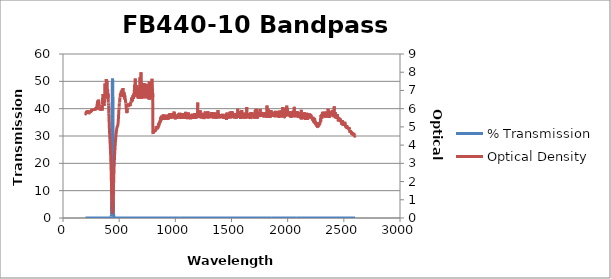
| Category | % Transmission |
|---|---|
| 2600.0 | 0.003 |
| 2599.0 | 0.003 |
| 2598.0 | 0.003 |
| 2597.0 | 0.003 |
| 2596.0 | 0.003 |
| 2595.0 | 0.003 |
| 2594.0 | 0.003 |
| 2593.0 | 0.003 |
| 2592.0 | 0.003 |
| 2591.0 | 0.003 |
| 2590.0 | 0.003 |
| 2589.0 | 0.003 |
| 2588.0 | 0.002 |
| 2587.0 | 0.003 |
| 2586.0 | 0.003 |
| 2585.0 | 0.003 |
| 2584.0 | 0.003 |
| 2583.0 | 0.002 |
| 2582.0 | 0.003 |
| 2581.0 | 0.003 |
| 2580.0 | 0.002 |
| 2579.0 | 0.002 |
| 2578.0 | 0.003 |
| 2577.0 | 0.003 |
| 2576.0 | 0.002 |
| 2575.0 | 0.002 |
| 2574.0 | 0.002 |
| 2573.0 | 0.002 |
| 2572.0 | 0.003 |
| 2571.0 | 0.002 |
| 2570.0 | 0.002 |
| 2569.0 | 0.002 |
| 2568.0 | 0.002 |
| 2567.0 | 0.002 |
| 2566.0 | 0.002 |
| 2565.0 | 0.002 |
| 2564.0 | 0.002 |
| 2563.0 | 0.002 |
| 2562.0 | 0.002 |
| 2561.0 | 0.002 |
| 2560.0 | 0.002 |
| 2559.0 | 0.002 |
| 2558.0 | 0.002 |
| 2557.0 | 0.002 |
| 2556.0 | 0.002 |
| 2555.0 | 0.002 |
| 2554.0 | 0.002 |
| 2553.0 | 0.001 |
| 2552.0 | 0.001 |
| 2551.0 | 0.001 |
| 2550.0 | 0.001 |
| 2549.0 | 0.001 |
| 2548.0 | 0.001 |
| 2547.0 | 0.001 |
| 2546.0 | 0.001 |
| 2545.0 | 0.001 |
| 2544.0 | 0.001 |
| 2543.0 | 0.001 |
| 2542.0 | 0.001 |
| 2541.0 | 0.001 |
| 2540.0 | 0.001 |
| 2539.0 | 0.001 |
| 2538.0 | 0.001 |
| 2537.0 | 0.001 |
| 2536.0 | 0.001 |
| 2535.0 | 0.001 |
| 2534.0 | 0.001 |
| 2533.0 | 0.001 |
| 2532.0 | 0.001 |
| 2531.0 | 0.001 |
| 2530.0 | 0.001 |
| 2529.0 | 0.001 |
| 2528.0 | 0.001 |
| 2527.0 | 0.001 |
| 2526.0 | 0.001 |
| 2525.0 | 0.001 |
| 2524.0 | 0.001 |
| 2523.0 | 0.001 |
| 2522.0 | 0.001 |
| 2521.0 | 0.001 |
| 2520.0 | 0.001 |
| 2519.0 | 0.001 |
| 2518.0 | 0.001 |
| 2517.0 | 0.001 |
| 2516.0 | 0.001 |
| 2515.0 | 0.001 |
| 2514.0 | 0.001 |
| 2513.0 | 0.001 |
| 2512.0 | 0.001 |
| 2511.0 | 0.001 |
| 2510.0 | 0.001 |
| 2509.0 | 0.001 |
| 2508.0 | 0.001 |
| 2507.0 | 0.001 |
| 2506.0 | 0.001 |
| 2505.0 | 0.001 |
| 2504.0 | 0.001 |
| 2503.0 | 0.001 |
| 2502.0 | 0.001 |
| 2501.0 | 0.001 |
| 2500.0 | 0.001 |
| 2499.0 | 0.001 |
| 2498.0 | 0.001 |
| 2497.0 | 0.001 |
| 2496.0 | 0.001 |
| 2495.0 | 0.001 |
| 2494.0 | 0.001 |
| 2493.0 | 0.001 |
| 2492.0 | 0.001 |
| 2491.0 | 0.001 |
| 2490.0 | 0.001 |
| 2489.0 | 0.001 |
| 2488.0 | 0.001 |
| 2487.0 | 0.001 |
| 2486.0 | 0.001 |
| 2485.0 | 0 |
| 2484.0 | 0.001 |
| 2483.0 | 0 |
| 2482.0 | 0.001 |
| 2481.0 | 0.001 |
| 2480.0 | 0.001 |
| 2479.0 | 0.001 |
| 2478.0 | 0 |
| 2477.0 | 0 |
| 2476.0 | 0 |
| 2475.0 | 0.001 |
| 2474.0 | 0 |
| 2473.0 | 0.001 |
| 2472.0 | 0 |
| 2471.0 | 0 |
| 2470.0 | 0 |
| 2469.0 | 0 |
| 2468.0 | 0 |
| 2467.0 | 0 |
| 2466.0 | 0 |
| 2465.0 | 0 |
| 2464.0 | 0 |
| 2463.0 | 0 |
| 2462.0 | 0 |
| 2461.0 | 0 |
| 2460.0 | 0 |
| 2459.0 | 0 |
| 2458.0 | 0 |
| 2457.0 | 0 |
| 2456.0 | 0 |
| 2455.0 | 0 |
| 2454.0 | 0 |
| 2453.0 | 0 |
| 2452.0 | 0 |
| 2451.0 | 0.001 |
| 2450.0 | 0 |
| 2449.0 | 0 |
| 2448.0 | 0 |
| 2447.0 | 0 |
| 2446.0 | 0 |
| 2445.0 | 0 |
| 2444.0 | 0 |
| 2443.0 | 0 |
| 2442.0 | 0 |
| 2441.0 | 0 |
| 2440.0 | 0 |
| 2439.0 | 0 |
| 2438.0 | 0 |
| 2437.0 | 0 |
| 2436.0 | 0 |
| 2435.0 | 0 |
| 2434.0 | 0 |
| 2433.0 | 0 |
| 2432.0 | 0 |
| 2431.0 | 0 |
| 2430.0 | 0 |
| 2429.0 | 0 |
| 2428.0 | 0 |
| 2427.0 | 0 |
| 2426.0 | 0 |
| 2425.0 | 0 |
| 2424.0 | 0 |
| 2423.0 | 0 |
| 2422.0 | 0 |
| 2421.0 | 0 |
| 2420.0 | 0 |
| 2419.0 | 0 |
| 2418.0 | 0 |
| 2417.0 | 0 |
| 2416.0 | 0 |
| 2415.0 | 0 |
| 2414.0 | 0 |
| 2413.0 | 0 |
| 2412.0 | 0 |
| 2411.0 | 0 |
| 2410.0 | 0 |
| 2409.0 | 0 |
| 2408.0 | 0 |
| 2407.0 | 0 |
| 2406.0 | 0 |
| 2405.0 | 0 |
| 2404.0 | 0 |
| 2403.0 | 0 |
| 2402.0 | 0 |
| 2401.0 | 0 |
| 2400.0 | 0 |
| 2399.0 | 0 |
| 2398.0 | 0 |
| 2397.0 | 0 |
| 2396.0 | 0 |
| 2395.0 | 0 |
| 2394.0 | 0 |
| 2393.0 | 0 |
| 2392.0 | 0 |
| 2391.0 | 0 |
| 2390.0 | 0 |
| 2389.0 | 0 |
| 2388.0 | 0 |
| 2387.0 | 0 |
| 2386.0 | 0 |
| 2385.0 | 0 |
| 2384.0 | 0 |
| 2383.0 | 0 |
| 2382.0 | 0 |
| 2381.0 | 0 |
| 2380.0 | 0 |
| 2379.0 | 0 |
| 2378.0 | 0 |
| 2377.0 | 0 |
| 2376.0 | 0 |
| 2375.0 | 0 |
| 2374.0 | 0 |
| 2373.0 | 0 |
| 2372.0 | 0 |
| 2371.0 | 0 |
| 2370.0 | 0 |
| 2369.0 | 0 |
| 2368.0 | 0 |
| 2367.0 | 0 |
| 2366.0 | 0 |
| 2365.0 | 0 |
| 2364.0 | 0 |
| 2363.0 | 0 |
| 2362.0 | 0 |
| 2361.0 | 0 |
| 2360.0 | 0 |
| 2359.0 | 0 |
| 2358.0 | 0 |
| 2357.0 | 0 |
| 2356.0 | 0 |
| 2355.0 | 0 |
| 2354.0 | 0 |
| 2353.0 | 0 |
| 2352.0 | 0 |
| 2351.0 | 0 |
| 2350.0 | 0 |
| 2349.0 | 0 |
| 2348.0 | 0 |
| 2347.0 | 0 |
| 2346.0 | 0 |
| 2345.0 | 0 |
| 2344.0 | 0 |
| 2343.0 | 0 |
| 2342.0 | 0 |
| 2341.0 | 0 |
| 2340.0 | 0 |
| 2339.0 | 0 |
| 2338.0 | 0 |
| 2337.0 | 0 |
| 2336.0 | 0 |
| 2335.0 | 0 |
| 2334.0 | 0 |
| 2333.0 | 0 |
| 2332.0 | 0 |
| 2331.0 | 0 |
| 2330.0 | 0 |
| 2329.0 | 0 |
| 2328.0 | 0 |
| 2327.0 | 0 |
| 2326.0 | 0 |
| 2325.0 | 0 |
| 2324.0 | 0 |
| 2323.0 | 0 |
| 2322.0 | 0 |
| 2321.0 | 0 |
| 2320.0 | 0 |
| 2319.0 | 0 |
| 2318.0 | 0 |
| 2317.0 | 0 |
| 2316.0 | 0 |
| 2315.0 | 0 |
| 2314.0 | 0 |
| 2313.0 | 0 |
| 2312.0 | 0 |
| 2311.0 | 0 |
| 2310.0 | 0 |
| 2309.0 | 0 |
| 2308.0 | 0 |
| 2307.0 | 0 |
| 2306.0 | 0 |
| 2305.0 | 0 |
| 2304.0 | 0 |
| 2303.0 | 0 |
| 2302.0 | 0 |
| 2301.0 | 0 |
| 2300.0 | 0 |
| 2299.0 | 0 |
| 2298.0 | 0 |
| 2297.0 | 0 |
| 2296.0 | 0 |
| 2295.0 | 0 |
| 2294.0 | 0.001 |
| 2293.0 | 0 |
| 2292.0 | 0 |
| 2291.0 | 0.001 |
| 2290.0 | 0.001 |
| 2289.0 | 0.001 |
| 2288.0 | 0.001 |
| 2287.0 | 0.001 |
| 2286.0 | 0.001 |
| 2285.0 | 0.001 |
| 2284.0 | 0.001 |
| 2283.0 | 0.001 |
| 2282.0 | 0.001 |
| 2281.0 | 0.001 |
| 2280.0 | 0.001 |
| 2279.0 | 0.001 |
| 2278.0 | 0.001 |
| 2277.0 | 0.001 |
| 2276.0 | 0.001 |
| 2275.0 | 0.001 |
| 2274.0 | 0.001 |
| 2273.0 | 0.001 |
| 2272.0 | 0.001 |
| 2271.0 | 0.001 |
| 2270.0 | 0.001 |
| 2269.0 | 0.001 |
| 2268.0 | 0.001 |
| 2267.0 | 0.001 |
| 2266.0 | 0.001 |
| 2265.0 | 0.001 |
| 2264.0 | 0.001 |
| 2263.0 | 0.001 |
| 2262.0 | 0.001 |
| 2261.0 | 0.001 |
| 2260.0 | 0.001 |
| 2259.0 | 0.001 |
| 2258.0 | 0.001 |
| 2257.0 | 0.001 |
| 2256.0 | 0.001 |
| 2255.0 | 0.001 |
| 2254.0 | 0.001 |
| 2253.0 | 0.001 |
| 2252.0 | 0.001 |
| 2251.0 | 0.001 |
| 2250.0 | 0.001 |
| 2249.0 | 0.001 |
| 2248.0 | 0.001 |
| 2247.0 | 0.001 |
| 2246.0 | 0 |
| 2245.0 | 0 |
| 2244.0 | 0 |
| 2243.0 | 0 |
| 2242.0 | 0.001 |
| 2241.0 | 0.001 |
| 2240.0 | 0 |
| 2239.0 | 0 |
| 2238.0 | 0 |
| 2237.0 | 0 |
| 2236.0 | 0 |
| 2235.0 | 0 |
| 2234.0 | 0 |
| 2233.0 | 0.001 |
| 2232.0 | 0 |
| 2231.0 | 0.001 |
| 2230.0 | 0 |
| 2229.0 | 0 |
| 2228.0 | 0 |
| 2227.0 | 0 |
| 2226.0 | 0 |
| 2225.0 | 0 |
| 2224.0 | 0 |
| 2223.0 | 0 |
| 2222.0 | 0 |
| 2221.0 | 0 |
| 2220.0 | 0 |
| 2219.0 | 0 |
| 2218.0 | 0 |
| 2217.0 | 0 |
| 2216.0 | 0 |
| 2215.0 | 0 |
| 2214.0 | 0 |
| 2213.0 | 0 |
| 2212.0 | 0 |
| 2211.0 | 0 |
| 2210.0 | 0 |
| 2209.0 | 0 |
| 2208.0 | 0 |
| 2207.0 | 0 |
| 2206.0 | 0 |
| 2205.0 | 0 |
| 2204.0 | 0 |
| 2203.0 | 0 |
| 2202.0 | 0 |
| 2201.0 | 0 |
| 2200.0 | 0 |
| 2199.0 | 0 |
| 2198.0 | 0 |
| 2197.0 | 0 |
| 2196.0 | 0 |
| 2195.0 | 0 |
| 2194.0 | 0 |
| 2193.0 | 0 |
| 2192.0 | 0 |
| 2191.0 | 0 |
| 2190.0 | 0 |
| 2189.0 | 0 |
| 2188.0 | 0 |
| 2187.0 | 0 |
| 2186.0 | 0 |
| 2185.0 | 0 |
| 2184.0 | 0 |
| 2183.0 | 0 |
| 2182.0 | 0 |
| 2181.0 | 0 |
| 2180.0 | 0 |
| 2179.0 | 0 |
| 2178.0 | 0 |
| 2177.0 | 0 |
| 2176.0 | 0 |
| 2175.0 | 0 |
| 2174.0 | 0 |
| 2173.0 | 0 |
| 2172.0 | 0 |
| 2171.0 | 0 |
| 2170.0 | 0 |
| 2169.0 | 0 |
| 2168.0 | 0 |
| 2167.0 | 0 |
| 2166.0 | 0 |
| 2165.0 | 0 |
| 2164.0 | 0 |
| 2163.0 | 0 |
| 2162.0 | 0 |
| 2161.0 | 0 |
| 2160.0 | 0 |
| 2159.0 | 0 |
| 2158.0 | 0 |
| 2157.0 | 0 |
| 2156.0 | 0 |
| 2155.0 | 0 |
| 2154.0 | 0 |
| 2153.0 | 0 |
| 2152.0 | 0 |
| 2151.0 | 0 |
| 2150.0 | 0 |
| 2149.0 | 0 |
| 2148.0 | 0 |
| 2147.0 | 0 |
| 2146.0 | 0 |
| 2145.0 | 0 |
| 2144.0 | 0 |
| 2143.0 | 0 |
| 2142.0 | 0 |
| 2141.0 | 0 |
| 2140.0 | 0 |
| 2139.0 | 0 |
| 2138.0 | 0 |
| 2137.0 | 0 |
| 2136.0 | 0 |
| 2135.0 | 0 |
| 2134.0 | 0 |
| 2133.0 | 0 |
| 2132.0 | 0 |
| 2131.0 | 0 |
| 2130.0 | 0 |
| 2129.0 | 0 |
| 2128.0 | 0 |
| 2127.0 | 0 |
| 2126.0 | 0 |
| 2125.0 | 0 |
| 2124.0 | 0 |
| 2123.0 | 0 |
| 2122.0 | 0 |
| 2121.0 | 0 |
| 2120.0 | 0 |
| 2119.0 | 0 |
| 2118.0 | 0 |
| 2117.0 | 0 |
| 2116.0 | 0 |
| 2115.0 | 0 |
| 2114.0 | 0 |
| 2113.0 | 0 |
| 2112.0 | 0 |
| 2111.0 | 0 |
| 2110.0 | 0 |
| 2109.0 | 0 |
| 2108.0 | 0 |
| 2107.0 | 0 |
| 2106.0 | 0 |
| 2105.0 | 0 |
| 2104.0 | 0 |
| 2103.0 | 0 |
| 2102.0 | 0 |
| 2101.0 | 0 |
| 2100.0 | 0 |
| 2099.0 | 0 |
| 2098.0 | 0 |
| 2097.0 | 0 |
| 2096.0 | 0 |
| 2095.0 | 0 |
| 2094.0 | 0 |
| 2093.0 | 0 |
| 2092.0 | 0 |
| 2091.0 | 0 |
| 2090.0 | 0 |
| 2089.0 | 0 |
| 2088.0 | 0 |
| 2087.0 | 0 |
| 2086.0 | 0 |
| 2085.0 | 0 |
| 2084.0 | 0 |
| 2083.0 | 0 |
| 2082.0 | 0 |
| 2081.0 | 0 |
| 2080.0 | 0 |
| 2079.0 | 0 |
| 2078.0 | 0 |
| 2077.0 | 0 |
| 2076.0 | 0 |
| 2075.0 | 0 |
| 2074.0 | 0 |
| 2073.0 | 0 |
| 2072.0 | 0 |
| 2071.0 | 0 |
| 2070.0 | 0 |
| 2069.0 | 0 |
| 2068.0 | 0 |
| 2067.0 | 0 |
| 2066.0 | 0 |
| 2065.0 | 0 |
| 2064.0 | 0 |
| 2063.0 | 0 |
| 2062.0 | 0 |
| 2061.0 | 0 |
| 2060.0 | 0 |
| 2059.0 | 0 |
| 2058.0 | 0 |
| 2057.0 | 0 |
| 2056.0 | 0 |
| 2055.0 | 0 |
| 2054.0 | 0 |
| 2053.0 | 0 |
| 2052.0 | 0 |
| 2051.0 | 0 |
| 2050.0 | 0 |
| 2049.0 | 0 |
| 2048.0 | 0 |
| 2047.0 | 0 |
| 2046.0 | 0 |
| 2045.0 | 0 |
| 2044.0 | 0 |
| 2043.0 | 0 |
| 2042.0 | 0 |
| 2041.0 | 0 |
| 2040.0 | 0 |
| 2039.0 | 0 |
| 2038.0 | 0 |
| 2037.0 | 0 |
| 2036.0 | 0 |
| 2035.0 | 0 |
| 2034.0 | 0 |
| 2033.0 | 0 |
| 2032.0 | 0 |
| 2031.0 | 0 |
| 2030.0 | 0 |
| 2029.0 | 0 |
| 2028.0 | 0 |
| 2027.0 | 0 |
| 2026.0 | 0 |
| 2025.0 | 0 |
| 2024.0 | 0 |
| 2023.0 | 0 |
| 2022.0 | 0 |
| 2021.0 | 0 |
| 2020.0 | 0 |
| 2019.0 | 0 |
| 2018.0 | 0 |
| 2017.0 | 0 |
| 2016.0 | 0 |
| 2015.0 | 0 |
| 2014.0 | 0 |
| 2013.0 | 0 |
| 2012.0 | 0 |
| 2011.0 | 0 |
| 2010.0 | 0 |
| 2009.0 | 0 |
| 2008.0 | 0 |
| 2007.0 | 0 |
| 2006.0 | 0 |
| 2005.0 | 0 |
| 2004.0 | 0 |
| 2003.0 | 0 |
| 2002.0 | 0 |
| 2001.0 | 0 |
| 2000.0 | 0 |
| 1999.0 | 0 |
| 1998.0 | 0 |
| 1997.0 | 0 |
| 1996.0 | 0 |
| 1995.0 | 0 |
| 1994.0 | 0 |
| 1993.0 | 0 |
| 1992.0 | 0 |
| 1991.0 | 0 |
| 1990.0 | 0 |
| 1989.0 | 0 |
| 1988.0 | 0 |
| 1987.0 | 0 |
| 1986.0 | 0 |
| 1985.0 | 0 |
| 1984.0 | 0 |
| 1983.0 | 0 |
| 1982.0 | 0 |
| 1981.0 | 0 |
| 1980.0 | 0 |
| 1979.0 | 0 |
| 1978.0 | 0 |
| 1977.0 | 0 |
| 1976.0 | 0 |
| 1975.0 | 0 |
| 1974.0 | 0 |
| 1973.0 | 0 |
| 1972.0 | 0 |
| 1971.0 | 0 |
| 1970.0 | 0 |
| 1969.0 | 0 |
| 1968.0 | 0 |
| 1967.0 | 0 |
| 1966.0 | 0 |
| 1965.0 | 0 |
| 1964.0 | 0 |
| 1963.0 | 0 |
| 1962.0 | 0 |
| 1961.0 | 0 |
| 1960.0 | 0 |
| 1959.0 | 0 |
| 1958.0 | 0 |
| 1957.0 | 0 |
| 1956.0 | 0 |
| 1955.0 | 0 |
| 1954.0 | 0 |
| 1953.0 | 0 |
| 1952.0 | 0 |
| 1951.0 | 0 |
| 1950.0 | 0 |
| 1949.0 | 0 |
| 1948.0 | 0 |
| 1947.0 | 0 |
| 1946.0 | 0 |
| 1945.0 | 0 |
| 1944.0 | 0 |
| 1943.0 | 0 |
| 1942.0 | 0 |
| 1941.0 | 0 |
| 1940.0 | 0 |
| 1939.0 | 0 |
| 1938.0 | 0 |
| 1937.0 | 0 |
| 1936.0 | 0 |
| 1935.0 | 0 |
| 1934.0 | 0 |
| 1933.0 | 0 |
| 1932.0 | 0 |
| 1931.0 | 0 |
| 1930.0 | 0 |
| 1929.0 | 0 |
| 1928.0 | 0 |
| 1927.0 | 0 |
| 1926.0 | 0 |
| 1925.0 | 0 |
| 1924.0 | 0 |
| 1923.0 | 0 |
| 1922.0 | 0 |
| 1921.0 | 0 |
| 1920.0 | 0 |
| 1919.0 | 0 |
| 1918.0 | 0 |
| 1917.0 | 0 |
| 1916.0 | 0 |
| 1915.0 | 0 |
| 1914.0 | 0 |
| 1913.0 | 0 |
| 1912.0 | 0 |
| 1911.0 | 0 |
| 1910.0 | 0 |
| 1909.0 | 0 |
| 1908.0 | 0 |
| 1907.0 | 0 |
| 1906.0 | 0 |
| 1905.0 | 0 |
| 1904.0 | 0 |
| 1903.0 | 0 |
| 1902.0 | 0 |
| 1901.0 | 0 |
| 1900.0 | 0 |
| 1899.0 | 0 |
| 1898.0 | 0 |
| 1897.0 | 0 |
| 1896.0 | 0 |
| 1895.0 | 0 |
| 1894.0 | 0 |
| 1893.0 | 0 |
| 1892.0 | 0 |
| 1891.0 | 0 |
| 1890.0 | 0 |
| 1889.0 | 0 |
| 1888.0 | 0 |
| 1887.0 | 0 |
| 1886.0 | 0 |
| 1885.0 | 0 |
| 1884.0 | 0 |
| 1883.0 | 0 |
| 1882.0 | 0 |
| 1881.0 | 0 |
| 1880.0 | 0 |
| 1879.0 | 0 |
| 1878.0 | 0 |
| 1877.0 | 0 |
| 1876.0 | 0 |
| 1875.0 | 0 |
| 1874.0 | 0 |
| 1873.0 | 0 |
| 1872.0 | 0 |
| 1871.0 | 0 |
| 1870.0 | 0 |
| 1869.0 | 0 |
| 1868.0 | 0 |
| 1867.0 | 0 |
| 1866.0 | 0 |
| 1865.0 | 0 |
| 1864.0 | 0 |
| 1863.0 | 0 |
| 1862.0 | 0 |
| 1861.0 | 0 |
| 1860.0 | 0 |
| 1859.0 | 0 |
| 1858.0 | 0 |
| 1857.0 | 0 |
| 1856.0 | 0 |
| 1855.0 | 0 |
| 1854.0 | 0 |
| 1853.0 | 0 |
| 1852.0 | 0 |
| 1851.0 | 0 |
| 1850.0 | 0 |
| 1849.0 | 0 |
| 1848.0 | 0 |
| 1847.0 | 0 |
| 1846.0 | 0 |
| 1845.0 | 0 |
| 1844.0 | 0 |
| 1843.0 | 0 |
| 1842.0 | 0 |
| 1841.0 | 0 |
| 1840.0 | 0 |
| 1839.0 | 0 |
| 1838.0 | 0 |
| 1837.0 | 0 |
| 1836.0 | 0 |
| 1835.0 | 0 |
| 1834.0 | 0 |
| 1833.0 | 0 |
| 1832.0 | 0 |
| 1831.0 | 0 |
| 1830.0 | 0 |
| 1829.0 | 0 |
| 1828.0 | 0 |
| 1827.0 | 0 |
| 1826.0 | 0 |
| 1825.0 | 0 |
| 1824.0 | 0 |
| 1823.0 | 0 |
| 1822.0 | 0 |
| 1821.0 | 0 |
| 1820.0 | 0 |
| 1819.0 | 0 |
| 1818.0 | 0 |
| 1817.0 | 0 |
| 1816.0 | 0 |
| 1815.0 | 0 |
| 1814.0 | 0 |
| 1813.0 | 0 |
| 1812.0 | 0 |
| 1811.0 | 0 |
| 1810.0 | 0 |
| 1809.0 | 0 |
| 1808.0 | 0 |
| 1807.0 | 0 |
| 1806.0 | 0 |
| 1805.0 | 0 |
| 1804.0 | 0 |
| 1803.0 | 0 |
| 1802.0 | 0 |
| 1801.0 | 0 |
| 1800.0 | 0 |
| 1799.0 | 0 |
| 1798.0 | 0 |
| 1797.0 | 0 |
| 1796.0 | 0 |
| 1795.0 | 0 |
| 1794.0 | 0 |
| 1793.0 | 0 |
| 1792.0 | 0 |
| 1791.0 | 0 |
| 1790.0 | 0 |
| 1789.0 | 0 |
| 1788.0 | 0 |
| 1787.0 | 0 |
| 1786.0 | 0 |
| 1785.0 | 0 |
| 1784.0 | 0 |
| 1783.0 | 0 |
| 1782.0 | 0 |
| 1781.0 | 0 |
| 1780.0 | 0 |
| 1779.0 | 0 |
| 1778.0 | 0 |
| 1777.0 | 0 |
| 1776.0 | 0 |
| 1775.0 | 0 |
| 1774.0 | 0 |
| 1773.0 | 0 |
| 1772.0 | 0 |
| 1771.0 | 0 |
| 1770.0 | 0 |
| 1769.0 | 0 |
| 1768.0 | 0 |
| 1767.0 | 0 |
| 1766.0 | 0 |
| 1765.0 | 0 |
| 1764.0 | 0 |
| 1763.0 | 0 |
| 1762.0 | 0 |
| 1761.0 | 0 |
| 1760.0 | 0 |
| 1759.0 | 0 |
| 1758.0 | 0 |
| 1757.0 | 0 |
| 1756.0 | 0 |
| 1755.0 | 0 |
| 1754.0 | 0 |
| 1753.0 | 0 |
| 1752.0 | 0 |
| 1751.0 | 0 |
| 1750.0 | 0 |
| 1749.0 | 0 |
| 1748.0 | 0 |
| 1747.0 | 0 |
| 1746.0 | 0 |
| 1745.0 | 0 |
| 1744.0 | 0 |
| 1743.0 | 0 |
| 1742.0 | 0 |
| 1741.0 | 0 |
| 1740.0 | 0 |
| 1739.0 | 0 |
| 1738.0 | 0 |
| 1737.0 | 0 |
| 1736.0 | 0 |
| 1735.0 | 0 |
| 1734.0 | 0 |
| 1733.0 | 0 |
| 1732.0 | 0 |
| 1731.0 | 0 |
| 1730.0 | 0 |
| 1729.0 | 0 |
| 1728.0 | 0 |
| 1727.0 | 0 |
| 1726.0 | 0 |
| 1725.0 | 0 |
| 1724.0 | 0 |
| 1723.0 | 0 |
| 1722.0 | 0 |
| 1721.0 | 0 |
| 1720.0 | 0 |
| 1719.0 | 0 |
| 1718.0 | 0 |
| 1717.0 | 0 |
| 1716.0 | 0 |
| 1715.0 | 0 |
| 1714.0 | 0 |
| 1713.0 | 0 |
| 1712.0 | 0 |
| 1711.0 | 0 |
| 1710.0 | 0 |
| 1709.0 | 0 |
| 1708.0 | 0 |
| 1707.0 | 0 |
| 1706.0 | 0 |
| 1705.0 | 0 |
| 1704.0 | 0 |
| 1703.0 | 0 |
| 1702.0 | 0 |
| 1701.0 | 0 |
| 1700.0 | 0 |
| 1699.0 | 0 |
| 1698.0 | 0 |
| 1697.0 | 0 |
| 1696.0 | 0 |
| 1695.0 | 0 |
| 1694.0 | 0 |
| 1693.0 | 0 |
| 1692.0 | 0 |
| 1691.0 | 0 |
| 1690.0 | 0 |
| 1689.0 | 0 |
| 1688.0 | 0 |
| 1687.0 | 0 |
| 1686.0 | 0 |
| 1685.0 | 0 |
| 1684.0 | 0 |
| 1683.0 | 0 |
| 1682.0 | 0 |
| 1681.0 | 0 |
| 1680.0 | 0 |
| 1679.0 | 0 |
| 1678.0 | 0 |
| 1677.0 | 0 |
| 1676.0 | 0 |
| 1675.0 | 0 |
| 1674.0 | 0 |
| 1673.0 | 0 |
| 1672.0 | 0 |
| 1671.0 | 0 |
| 1670.0 | 0 |
| 1669.0 | 0 |
| 1668.0 | 0 |
| 1667.0 | 0 |
| 1666.0 | 0 |
| 1665.0 | 0 |
| 1664.0 | 0 |
| 1663.0 | 0 |
| 1662.0 | 0 |
| 1661.0 | 0 |
| 1660.0 | 0 |
| 1659.0 | 0 |
| 1658.0 | 0 |
| 1657.0 | 0 |
| 1656.0 | 0 |
| 1655.0 | 0 |
| 1654.0 | 0 |
| 1653.0 | 0 |
| 1652.0 | 0 |
| 1651.0 | 0 |
| 1650.0 | 0 |
| 1649.0 | 0 |
| 1648.0 | 0 |
| 1647.0 | 0 |
| 1646.0 | 0 |
| 1645.0 | 0 |
| 1644.0 | 0 |
| 1643.0 | 0 |
| 1642.0 | 0 |
| 1641.0 | 0 |
| 1640.0 | 0 |
| 1639.0 | 0 |
| 1638.0 | 0 |
| 1637.0 | 0 |
| 1636.0 | 0 |
| 1635.0 | 0 |
| 1634.0 | 0 |
| 1633.0 | 0 |
| 1632.0 | 0 |
| 1631.0 | 0 |
| 1630.0 | 0 |
| 1629.0 | 0 |
| 1628.0 | 0 |
| 1627.0 | 0 |
| 1626.0 | 0 |
| 1625.0 | 0 |
| 1624.0 | 0 |
| 1623.0 | 0 |
| 1622.0 | 0 |
| 1621.0 | 0 |
| 1620.0 | 0 |
| 1619.0 | 0 |
| 1618.0 | 0 |
| 1617.0 | 0 |
| 1616.0 | 0 |
| 1615.0 | 0 |
| 1614.0 | 0 |
| 1613.0 | 0 |
| 1612.0 | 0 |
| 1611.0 | 0 |
| 1610.0 | 0 |
| 1609.0 | 0 |
| 1608.0 | 0 |
| 1607.0 | 0 |
| 1606.0 | 0 |
| 1605.0 | 0 |
| 1604.0 | 0 |
| 1603.0 | 0 |
| 1602.0 | 0 |
| 1601.0 | 0 |
| 1600.0 | 0 |
| 1599.0 | 0 |
| 1598.0 | 0 |
| 1597.0 | 0 |
| 1596.0 | 0 |
| 1595.0 | 0 |
| 1594.0 | 0 |
| 1593.0 | 0 |
| 1592.0 | 0 |
| 1591.0 | 0 |
| 1590.0 | 0 |
| 1589.0 | 0 |
| 1588.0 | 0 |
| 1587.0 | 0 |
| 1586.0 | 0 |
| 1585.0 | 0 |
| 1584.0 | 0 |
| 1583.0 | 0 |
| 1582.0 | 0 |
| 1581.0 | 0 |
| 1580.0 | 0 |
| 1579.0 | 0 |
| 1578.0 | 0 |
| 1577.0 | 0 |
| 1576.0 | 0 |
| 1575.0 | 0 |
| 1574.0 | 0 |
| 1573.0 | 0 |
| 1572.0 | 0 |
| 1571.0 | 0 |
| 1570.0 | 0 |
| 1569.0 | 0 |
| 1568.0 | 0 |
| 1567.0 | 0 |
| 1566.0 | 0 |
| 1565.0 | 0 |
| 1564.0 | 0 |
| 1563.0 | 0 |
| 1562.0 | 0 |
| 1561.0 | 0 |
| 1560.0 | 0 |
| 1559.0 | 0 |
| 1558.0 | 0 |
| 1557.0 | 0 |
| 1556.0 | 0 |
| 1555.0 | 0 |
| 1554.0 | 0 |
| 1553.0 | 0 |
| 1552.0 | 0 |
| 1551.0 | 0 |
| 1550.0 | 0 |
| 1549.0 | 0 |
| 1548.0 | 0 |
| 1547.0 | 0 |
| 1546.0 | 0 |
| 1545.0 | 0 |
| 1544.0 | 0 |
| 1543.0 | 0 |
| 1542.0 | 0 |
| 1541.0 | 0 |
| 1540.0 | 0 |
| 1539.0 | 0 |
| 1538.0 | 0 |
| 1537.0 | 0 |
| 1536.0 | 0 |
| 1535.0 | 0 |
| 1534.0 | 0 |
| 1533.0 | 0 |
| 1532.0 | 0 |
| 1531.0 | 0 |
| 1530.0 | 0 |
| 1529.0 | 0 |
| 1528.0 | 0 |
| 1527.0 | 0 |
| 1526.0 | 0 |
| 1525.0 | 0 |
| 1524.0 | 0 |
| 1523.0 | 0 |
| 1522.0 | 0 |
| 1521.0 | 0 |
| 1520.0 | 0 |
| 1519.0 | 0 |
| 1518.0 | 0 |
| 1517.0 | 0 |
| 1516.0 | 0 |
| 1515.0 | 0 |
| 1514.0 | 0 |
| 1513.0 | 0 |
| 1512.0 | 0 |
| 1511.0 | 0 |
| 1510.0 | 0 |
| 1509.0 | 0 |
| 1508.0 | 0 |
| 1507.0 | 0 |
| 1506.0 | 0 |
| 1505.0 | 0 |
| 1504.0 | 0 |
| 1503.0 | 0 |
| 1502.0 | 0 |
| 1501.0 | 0 |
| 1500.0 | 0 |
| 1499.0 | 0 |
| 1498.0 | 0 |
| 1497.0 | 0 |
| 1496.0 | 0 |
| 1495.0 | 0 |
| 1494.0 | 0 |
| 1493.0 | 0 |
| 1492.0 | 0 |
| 1491.0 | 0 |
| 1490.0 | 0 |
| 1489.0 | 0 |
| 1488.0 | 0 |
| 1487.0 | 0 |
| 1486.0 | 0 |
| 1485.0 | 0 |
| 1484.0 | 0 |
| 1483.0 | 0 |
| 1482.0 | 0 |
| 1481.0 | 0 |
| 1480.0 | 0 |
| 1479.0 | 0 |
| 1478.0 | 0 |
| 1477.0 | 0 |
| 1476.0 | 0 |
| 1475.0 | 0 |
| 1474.0 | 0 |
| 1473.0 | 0 |
| 1472.0 | 0 |
| 1471.0 | 0 |
| 1470.0 | 0 |
| 1469.0 | 0 |
| 1468.0 | 0 |
| 1467.0 | 0 |
| 1466.0 | 0 |
| 1465.0 | 0 |
| 1464.0 | 0 |
| 1463.0 | 0 |
| 1462.0 | 0 |
| 1461.0 | 0 |
| 1460.0 | 0 |
| 1459.0 | 0 |
| 1458.0 | 0 |
| 1457.0 | 0 |
| 1456.0 | 0 |
| 1455.0 | 0 |
| 1454.0 | 0 |
| 1453.0 | 0 |
| 1452.0 | 0 |
| 1451.0 | 0 |
| 1450.0 | 0 |
| 1449.0 | 0 |
| 1448.0 | 0 |
| 1447.0 | 0 |
| 1446.0 | 0 |
| 1445.0 | 0 |
| 1444.0 | 0 |
| 1443.0 | 0 |
| 1442.0 | 0 |
| 1441.0 | 0 |
| 1440.0 | 0 |
| 1439.0 | 0 |
| 1438.0 | 0 |
| 1437.0 | 0 |
| 1436.0 | 0 |
| 1435.0 | 0 |
| 1434.0 | 0 |
| 1433.0 | 0 |
| 1432.0 | 0 |
| 1431.0 | 0 |
| 1430.0 | 0 |
| 1429.0 | 0 |
| 1428.0 | 0 |
| 1427.0 | 0 |
| 1426.0 | 0 |
| 1425.0 | 0 |
| 1424.0 | 0 |
| 1423.0 | 0 |
| 1422.0 | 0 |
| 1421.0 | 0 |
| 1420.0 | 0 |
| 1419.0 | 0 |
| 1418.0 | 0 |
| 1417.0 | 0 |
| 1416.0 | 0 |
| 1415.0 | 0 |
| 1414.0 | 0 |
| 1413.0 | 0 |
| 1412.0 | 0 |
| 1411.0 | 0 |
| 1410.0 | 0 |
| 1409.0 | 0 |
| 1408.0 | 0 |
| 1407.0 | 0 |
| 1406.0 | 0 |
| 1405.0 | 0 |
| 1404.0 | 0 |
| 1403.0 | 0 |
| 1402.0 | 0 |
| 1401.0 | 0 |
| 1400.0 | 0 |
| 1399.0 | 0 |
| 1398.0 | 0 |
| 1397.0 | 0 |
| 1396.0 | 0 |
| 1395.0 | 0 |
| 1394.0 | 0 |
| 1393.0 | 0 |
| 1392.0 | 0 |
| 1391.0 | 0 |
| 1390.0 | 0 |
| 1389.0 | 0 |
| 1388.0 | 0 |
| 1387.0 | 0 |
| 1386.0 | 0 |
| 1385.0 | 0 |
| 1384.0 | 0 |
| 1383.0 | 0 |
| 1382.0 | 0 |
| 1381.0 | 0 |
| 1380.0 | 0 |
| 1379.0 | 0 |
| 1378.0 | 0 |
| 1377.0 | 0 |
| 1376.0 | 0 |
| 1375.0 | 0 |
| 1374.0 | 0 |
| 1373.0 | 0 |
| 1372.0 | 0 |
| 1371.0 | 0 |
| 1370.0 | 0 |
| 1369.0 | 0 |
| 1368.0 | 0 |
| 1367.0 | 0 |
| 1366.0 | 0 |
| 1365.0 | 0 |
| 1364.0 | 0 |
| 1363.0 | 0 |
| 1362.0 | 0 |
| 1361.0 | 0 |
| 1360.0 | 0 |
| 1359.0 | 0 |
| 1358.0 | 0 |
| 1357.0 | 0 |
| 1356.0 | 0 |
| 1355.0 | 0 |
| 1354.0 | 0 |
| 1353.0 | 0 |
| 1352.0 | 0 |
| 1351.0 | 0 |
| 1350.0 | 0 |
| 1349.0 | 0 |
| 1348.0 | 0 |
| 1347.0 | 0 |
| 1346.0 | 0 |
| 1345.0 | 0 |
| 1344.0 | 0 |
| 1343.0 | 0 |
| 1342.0 | 0 |
| 1341.0 | 0 |
| 1340.0 | 0 |
| 1339.0 | 0 |
| 1338.0 | 0 |
| 1337.0 | 0 |
| 1336.0 | 0 |
| 1335.0 | 0 |
| 1334.0 | 0 |
| 1333.0 | 0 |
| 1332.0 | 0 |
| 1331.0 | 0 |
| 1330.0 | 0 |
| 1329.0 | 0 |
| 1328.0 | 0 |
| 1327.0 | 0 |
| 1326.0 | 0 |
| 1325.0 | 0 |
| 1324.0 | 0 |
| 1323.0 | 0 |
| 1322.0 | 0 |
| 1321.0 | 0 |
| 1320.0 | 0 |
| 1319.0 | 0 |
| 1318.0 | 0 |
| 1317.0 | 0 |
| 1316.0 | 0 |
| 1315.0 | 0 |
| 1314.0 | 0 |
| 1313.0 | 0 |
| 1312.0 | 0 |
| 1311.0 | 0 |
| 1310.0 | 0 |
| 1309.0 | 0 |
| 1308.0 | 0 |
| 1307.0 | 0 |
| 1306.0 | 0 |
| 1305.0 | 0 |
| 1304.0 | 0 |
| 1303.0 | 0 |
| 1302.0 | 0 |
| 1301.0 | 0 |
| 1300.0 | 0 |
| 1299.0 | 0 |
| 1298.0 | 0 |
| 1297.0 | 0 |
| 1296.0 | 0 |
| 1295.0 | 0 |
| 1294.0 | 0 |
| 1293.0 | 0 |
| 1292.0 | 0 |
| 1291.0 | 0 |
| 1290.0 | 0 |
| 1289.0 | 0 |
| 1288.0 | 0 |
| 1287.0 | 0 |
| 1286.0 | 0 |
| 1285.0 | 0 |
| 1284.0 | 0 |
| 1283.0 | 0 |
| 1282.0 | 0 |
| 1281.0 | 0 |
| 1280.0 | 0 |
| 1279.0 | 0 |
| 1278.0 | 0 |
| 1277.0 | 0 |
| 1276.0 | 0 |
| 1275.0 | 0 |
| 1274.0 | 0 |
| 1273.0 | 0 |
| 1272.0 | 0 |
| 1271.0 | 0 |
| 1270.0 | 0 |
| 1269.0 | 0 |
| 1268.0 | 0 |
| 1267.0 | 0 |
| 1266.0 | 0 |
| 1265.0 | 0 |
| 1264.0 | 0 |
| 1263.0 | 0 |
| 1262.0 | 0 |
| 1261.0 | 0 |
| 1260.0 | 0 |
| 1259.0 | 0 |
| 1258.0 | 0 |
| 1257.0 | 0 |
| 1256.0 | 0 |
| 1255.0 | 0 |
| 1254.0 | 0 |
| 1253.0 | 0 |
| 1252.0 | 0 |
| 1251.0 | 0 |
| 1250.0 | 0 |
| 1249.0 | 0 |
| 1248.0 | 0 |
| 1247.0 | 0 |
| 1246.0 | 0 |
| 1245.0 | 0 |
| 1244.0 | 0 |
| 1243.0 | 0 |
| 1242.0 | 0 |
| 1241.0 | 0 |
| 1240.0 | 0 |
| 1239.0 | 0 |
| 1238.0 | 0 |
| 1237.0 | 0 |
| 1236.0 | 0 |
| 1235.0 | 0 |
| 1234.0 | 0 |
| 1233.0 | 0 |
| 1232.0 | 0 |
| 1231.0 | 0 |
| 1230.0 | 0 |
| 1229.0 | 0 |
| 1228.0 | 0 |
| 1227.0 | 0 |
| 1226.0 | 0 |
| 1225.0 | 0 |
| 1224.0 | 0 |
| 1223.0 | 0 |
| 1222.0 | 0 |
| 1221.0 | 0 |
| 1220.0 | 0 |
| 1219.0 | 0 |
| 1218.0 | 0 |
| 1217.0 | 0 |
| 1216.0 | 0 |
| 1215.0 | 0 |
| 1214.0 | 0 |
| 1213.0 | 0 |
| 1212.0 | 0 |
| 1211.0 | 0 |
| 1210.0 | 0 |
| 1209.0 | 0 |
| 1208.0 | 0 |
| 1207.0 | 0 |
| 1206.0 | 0 |
| 1205.0 | 0 |
| 1204.0 | 0 |
| 1203.0 | 0 |
| 1202.0 | 0 |
| 1201.0 | 0 |
| 1200.0 | 0 |
| 1199.0 | 0 |
| 1198.0 | 0 |
| 1197.0 | 0 |
| 1196.0 | 0 |
| 1195.0 | 0 |
| 1194.0 | 0 |
| 1193.0 | 0 |
| 1192.0 | 0 |
| 1191.0 | 0 |
| 1190.0 | 0 |
| 1189.0 | 0 |
| 1188.0 | 0 |
| 1187.0 | 0 |
| 1186.0 | 0 |
| 1185.0 | 0 |
| 1184.0 | 0 |
| 1183.0 | 0 |
| 1182.0 | 0 |
| 1181.0 | 0 |
| 1180.0 | 0 |
| 1179.0 | 0 |
| 1178.0 | 0 |
| 1177.0 | 0 |
| 1176.0 | 0 |
| 1175.0 | 0 |
| 1174.0 | 0 |
| 1173.0 | 0 |
| 1172.0 | 0 |
| 1171.0 | 0 |
| 1170.0 | 0 |
| 1169.0 | 0 |
| 1168.0 | 0 |
| 1167.0 | 0 |
| 1166.0 | 0 |
| 1165.0 | 0 |
| 1164.0 | 0 |
| 1163.0 | 0 |
| 1162.0 | 0 |
| 1161.0 | 0 |
| 1160.0 | 0 |
| 1159.0 | 0 |
| 1158.0 | 0 |
| 1157.0 | 0 |
| 1156.0 | 0 |
| 1155.0 | 0 |
| 1154.0 | 0 |
| 1153.0 | 0 |
| 1152.0 | 0 |
| 1151.0 | 0 |
| 1150.0 | 0 |
| 1149.0 | 0 |
| 1148.0 | 0 |
| 1147.0 | 0 |
| 1146.0 | 0 |
| 1145.0 | 0 |
| 1144.0 | 0 |
| 1143.0 | 0 |
| 1142.0 | 0 |
| 1141.0 | 0 |
| 1140.0 | 0 |
| 1139.0 | 0 |
| 1138.0 | 0 |
| 1137.0 | 0 |
| 1136.0 | 0 |
| 1135.0 | 0 |
| 1134.0 | 0 |
| 1133.0 | 0 |
| 1132.0 | 0 |
| 1131.0 | 0 |
| 1130.0 | 0 |
| 1129.0 | 0 |
| 1128.0 | 0 |
| 1127.0 | 0 |
| 1126.0 | 0 |
| 1125.0 | 0 |
| 1124.0 | 0 |
| 1123.0 | 0 |
| 1122.0 | 0 |
| 1121.0 | 0 |
| 1120.0 | 0 |
| 1119.0 | 0 |
| 1118.0 | 0 |
| 1117.0 | 0 |
| 1116.0 | 0 |
| 1115.0 | 0 |
| 1114.0 | 0 |
| 1113.0 | 0 |
| 1112.0 | 0 |
| 1111.0 | 0 |
| 1110.0 | 0 |
| 1109.0 | 0 |
| 1108.0 | 0 |
| 1107.0 | 0 |
| 1106.0 | 0 |
| 1105.0 | 0 |
| 1104.0 | 0 |
| 1103.0 | 0 |
| 1102.0 | 0 |
| 1101.0 | 0 |
| 1100.0 | 0 |
| 1099.0 | 0 |
| 1098.0 | 0 |
| 1097.0 | 0 |
| 1096.0 | 0 |
| 1095.0 | 0 |
| 1094.0 | 0 |
| 1093.0 | 0 |
| 1092.0 | 0 |
| 1091.0 | 0 |
| 1090.0 | 0 |
| 1089.0 | 0 |
| 1088.0 | 0 |
| 1087.0 | 0 |
| 1086.0 | 0 |
| 1085.0 | 0 |
| 1084.0 | 0 |
| 1083.0 | 0 |
| 1082.0 | 0 |
| 1081.0 | 0 |
| 1080.0 | 0 |
| 1079.0 | 0 |
| 1078.0 | 0 |
| 1077.0 | 0 |
| 1076.0 | 0 |
| 1075.0 | 0 |
| 1074.0 | 0 |
| 1073.0 | 0 |
| 1072.0 | 0 |
| 1071.0 | 0 |
| 1070.0 | 0 |
| 1069.0 | 0 |
| 1068.0 | 0 |
| 1067.0 | 0 |
| 1066.0 | 0 |
| 1065.0 | 0 |
| 1064.0 | 0 |
| 1063.0 | 0 |
| 1062.0 | 0 |
| 1061.0 | 0 |
| 1060.0 | 0 |
| 1059.0 | 0 |
| 1058.0 | 0 |
| 1057.0 | 0 |
| 1056.0 | 0 |
| 1055.0 | 0 |
| 1054.0 | 0 |
| 1053.0 | 0 |
| 1052.0 | 0 |
| 1051.0 | 0 |
| 1050.0 | 0 |
| 1049.0 | 0 |
| 1048.0 | 0 |
| 1047.0 | 0 |
| 1046.0 | 0 |
| 1045.0 | 0 |
| 1044.0 | 0 |
| 1043.0 | 0 |
| 1042.0 | 0 |
| 1041.0 | 0 |
| 1040.0 | 0 |
| 1039.0 | 0 |
| 1038.0 | 0 |
| 1037.0 | 0 |
| 1036.0 | 0 |
| 1035.0 | 0 |
| 1034.0 | 0 |
| 1033.0 | 0 |
| 1032.0 | 0 |
| 1031.0 | 0 |
| 1030.0 | 0 |
| 1029.0 | 0 |
| 1028.0 | 0 |
| 1027.0 | 0 |
| 1026.0 | 0 |
| 1025.0 | 0 |
| 1024.0 | 0 |
| 1023.0 | 0 |
| 1022.0 | 0 |
| 1021.0 | 0 |
| 1020.0 | 0 |
| 1019.0 | 0 |
| 1018.0 | 0 |
| 1017.0 | 0 |
| 1016.0 | 0 |
| 1015.0 | 0 |
| 1014.0 | 0 |
| 1013.0 | 0 |
| 1012.0 | 0 |
| 1011.0 | 0 |
| 1010.0 | 0 |
| 1009.0 | 0 |
| 1008.0 | 0 |
| 1007.0 | 0 |
| 1006.0 | 0 |
| 1005.0 | 0 |
| 1004.0 | 0 |
| 1003.0 | 0 |
| 1002.0 | 0 |
| 1001.0 | 0 |
| 1000.0 | 0 |
| 999.0 | 0 |
| 998.0 | 0 |
| 997.0 | 0 |
| 996.0 | 0 |
| 995.0 | 0 |
| 994.0 | 0 |
| 993.0 | 0 |
| 992.0 | 0 |
| 991.0 | 0 |
| 990.0 | 0 |
| 989.0 | 0 |
| 988.0 | 0 |
| 987.0 | 0 |
| 986.0 | 0 |
| 985.0 | 0 |
| 984.0 | 0 |
| 983.0 | 0 |
| 982.0 | 0 |
| 981.0 | 0 |
| 980.0 | 0 |
| 979.0 | 0 |
| 978.0 | 0 |
| 977.0 | 0 |
| 976.0 | 0 |
| 975.0 | 0 |
| 974.0 | 0 |
| 973.0 | 0 |
| 972.0 | 0 |
| 971.0 | 0 |
| 970.0 | 0 |
| 969.0 | 0 |
| 968.0 | 0 |
| 967.0 | 0 |
| 966.0 | 0 |
| 965.0 | 0 |
| 964.0 | 0 |
| 963.0 | 0 |
| 962.0 | 0 |
| 961.0 | 0 |
| 960.0 | 0 |
| 959.0 | 0 |
| 958.0 | 0 |
| 957.0 | 0 |
| 956.0 | 0 |
| 955.0 | 0 |
| 954.0 | 0 |
| 953.0 | 0 |
| 952.0 | 0 |
| 951.0 | 0 |
| 950.0 | 0 |
| 949.0 | 0 |
| 948.0 | 0 |
| 947.0 | 0 |
| 946.0 | 0 |
| 945.0 | 0 |
| 944.0 | 0 |
| 943.0 | 0 |
| 942.0 | 0 |
| 941.0 | 0 |
| 940.0 | 0 |
| 939.0 | 0 |
| 938.0 | 0 |
| 937.0 | 0 |
| 936.0 | 0 |
| 935.0 | 0 |
| 934.0 | 0 |
| 933.0 | 0 |
| 932.0 | 0 |
| 931.0 | 0 |
| 930.0 | 0 |
| 929.0 | 0 |
| 928.0 | 0 |
| 927.0 | 0 |
| 926.0 | 0 |
| 925.0 | 0 |
| 924.0 | 0 |
| 923.0 | 0 |
| 922.0 | 0 |
| 921.0 | 0 |
| 920.0 | 0 |
| 919.0 | 0 |
| 918.0 | 0 |
| 917.0 | 0 |
| 916.0 | 0 |
| 915.0 | 0 |
| 914.0 | 0 |
| 913.0 | 0 |
| 912.0 | 0 |
| 911.0 | 0 |
| 910.0 | 0 |
| 909.0 | 0 |
| 908.0 | 0 |
| 907.0 | 0 |
| 906.0 | 0 |
| 905.0 | 0 |
| 904.0 | 0 |
| 903.0 | 0 |
| 902.0 | 0 |
| 901.0 | 0 |
| 900.0 | 0 |
| 899.0 | 0 |
| 898.0 | 0 |
| 897.0 | 0 |
| 896.0 | 0 |
| 895.0 | 0 |
| 894.0 | 0 |
| 893.0 | 0 |
| 892.0 | 0 |
| 891.0 | 0 |
| 890.0 | 0 |
| 889.0 | 0 |
| 888.0 | 0 |
| 887.0 | 0 |
| 886.0 | 0 |
| 885.0 | 0 |
| 884.0 | 0 |
| 883.0 | 0 |
| 882.0 | 0 |
| 881.0 | 0 |
| 880.0 | 0 |
| 879.0 | 0 |
| 878.0 | 0 |
| 877.0 | 0 |
| 876.0 | 0 |
| 875.0 | 0 |
| 874.0 | 0 |
| 873.0 | 0 |
| 872.0 | 0 |
| 871.0 | 0 |
| 870.0 | 0 |
| 869.0 | 0 |
| 868.0 | 0 |
| 867.0 | 0.001 |
| 866.0 | 0.001 |
| 865.0 | 0.001 |
| 864.0 | 0 |
| 863.0 | 0 |
| 862.0 | 0.001 |
| 861.0 | 0.001 |
| 860.0 | 0.001 |
| 859.0 | 0.001 |
| 858.0 | 0.001 |
| 857.0 | 0.001 |
| 856.0 | 0.001 |
| 855.0 | 0.001 |
| 854.0 | 0.001 |
| 853.0 | 0.001 |
| 852.0 | 0.001 |
| 851.0 | 0.001 |
| 850.0 | 0.001 |
| 849.0 | 0.001 |
| 848.0 | 0.001 |
| 847.0 | 0.001 |
| 846.0 | 0.001 |
| 845.0 | 0.001 |
| 844.0 | 0.001 |
| 843.0 | 0.001 |
| 842.0 | 0.001 |
| 841.0 | 0.001 |
| 840.0 | 0.001 |
| 839.0 | 0.001 |
| 838.0 | 0.001 |
| 837.0 | 0.001 |
| 836.0 | 0.001 |
| 835.0 | 0.001 |
| 834.0 | 0.001 |
| 833.0 | 0.001 |
| 832.0 | 0.001 |
| 831.0 | 0.001 |
| 830.0 | 0.001 |
| 829.0 | 0.001 |
| 828.0 | 0.001 |
| 827.0 | 0.001 |
| 826.0 | 0.001 |
| 825.0 | 0.002 |
| 824.0 | 0.001 |
| 823.0 | 0.001 |
| 822.0 | 0.002 |
| 821.0 | 0.002 |
| 820.0 | 0.001 |
| 819.0 | 0.002 |
| 818.0 | 0.002 |
| 817.0 | 0.002 |
| 816.0 | 0.002 |
| 815.0 | 0.002 |
| 814.0 | 0.002 |
| 813.0 | 0.002 |
| 812.0 | 0.002 |
| 811.0 | 0.002 |
| 810.0 | 0.002 |
| 809.0 | 0.002 |
| 808.0 | 0.002 |
| 807.0 | 0.002 |
| 806.0 | 0.002 |
| 805.0 | 0.002 |
| 804.0 | 0.002 |
| 803.0 | 0.002 |
| 802.0 | 0.002 |
| 801.0 | 0.002 |
| 800.0 | 0.002 |
| 799.0 | 0 |
| 798.0 | 0 |
| 797.0 | 0 |
| 796.0 | 0 |
| 795.0 | 0 |
| 794.0 | 0 |
| 793.0 | 0 |
| 792.0 | 0 |
| 791.0 | 0 |
| 790.0 | 0 |
| 789.0 | 0 |
| 788.0 | 0 |
| 787.0 | 0 |
| 786.0 | 0 |
| 785.0 | 0 |
| 784.0 | 0 |
| 783.0 | 0 |
| 782.0 | 0 |
| 781.0 | 0 |
| 780.0 | 0 |
| 779.0 | 0 |
| 778.0 | 0 |
| 777.0 | 0 |
| 776.0 | 0 |
| 775.0 | 0 |
| 774.0 | 0 |
| 773.0 | 0 |
| 772.0 | 0 |
| 771.0 | 0 |
| 770.0 | 0 |
| 769.0 | 0 |
| 768.0 | 0 |
| 767.0 | 0 |
| 766.0 | 0 |
| 765.0 | 0 |
| 764.0 | 0 |
| 763.0 | 0 |
| 762.0 | 0 |
| 761.0 | 0 |
| 760.0 | 0 |
| 759.0 | 0 |
| 758.0 | 0 |
| 757.0 | 0 |
| 756.0 | 0 |
| 755.0 | 0 |
| 754.0 | 0 |
| 753.0 | 0 |
| 752.0 | 0 |
| 751.0 | 0 |
| 750.0 | 0 |
| 749.0 | 0 |
| 748.0 | 0 |
| 747.0 | 0 |
| 746.0 | 0 |
| 745.0 | 0 |
| 744.0 | 0 |
| 743.0 | 0 |
| 742.0 | 0 |
| 741.0 | 0 |
| 740.0 | 0 |
| 739.0 | 0 |
| 738.0 | 0 |
| 737.0 | 0 |
| 736.0 | 0 |
| 735.0 | 0 |
| 734.0 | 0 |
| 733.0 | 0 |
| 732.0 | 0 |
| 731.0 | 0 |
| 730.0 | 0 |
| 729.0 | 0 |
| 728.0 | 0 |
| 727.0 | 0 |
| 726.0 | 0 |
| 725.0 | 0 |
| 724.0 | 0 |
| 723.0 | 0 |
| 722.0 | 0 |
| 721.0 | 0 |
| 720.0 | 0 |
| 719.0 | 0 |
| 718.0 | 0 |
| 717.0 | 0 |
| 716.0 | 0 |
| 715.0 | 0 |
| 714.0 | 0 |
| 713.0 | 0 |
| 712.0 | 0 |
| 711.0 | 0 |
| 710.0 | 0 |
| 709.0 | 0 |
| 708.0 | 0 |
| 707.0 | 0 |
| 706.0 | 0 |
| 705.0 | 0 |
| 704.0 | 0 |
| 703.0 | 0 |
| 702.0 | 0 |
| 701.0 | 0 |
| 700.0 | 0 |
| 699.0 | 0 |
| 698.0 | 0 |
| 697.0 | 0 |
| 696.0 | 0 |
| 695.0 | 0 |
| 694.0 | 0 |
| 693.0 | 0 |
| 692.0 | 0 |
| 691.0 | 0 |
| 690.0 | 0 |
| 689.0 | 0 |
| 688.0 | 0 |
| 687.0 | 0 |
| 686.0 | 0 |
| 685.0 | 0 |
| 684.0 | 0 |
| 683.0 | 0 |
| 682.0 | 0 |
| 681.0 | 0 |
| 680.0 | 0 |
| 679.0 | 0 |
| 678.0 | 0 |
| 677.0 | 0 |
| 676.0 | 0 |
| 675.0 | 0 |
| 674.0 | 0 |
| 673.0 | 0 |
| 672.0 | 0 |
| 671.0 | 0 |
| 670.0 | 0 |
| 669.0 | 0 |
| 668.0 | 0 |
| 667.0 | 0 |
| 666.0 | 0 |
| 665.0 | 0 |
| 664.0 | 0 |
| 663.0 | 0 |
| 662.0 | 0 |
| 661.0 | 0 |
| 660.0 | 0 |
| 659.0 | 0 |
| 658.0 | 0 |
| 657.0 | 0 |
| 656.0 | 0 |
| 655.0 | 0 |
| 654.0 | 0 |
| 653.0 | 0 |
| 652.0 | 0 |
| 651.0 | 0 |
| 650.0 | 0 |
| 649.0 | 0 |
| 648.0 | 0 |
| 647.0 | 0 |
| 646.0 | 0 |
| 645.0 | 0 |
| 644.0 | 0 |
| 643.0 | 0 |
| 642.0 | 0 |
| 641.0 | 0 |
| 640.0 | 0 |
| 639.0 | 0 |
| 638.0 | 0 |
| 637.0 | 0 |
| 636.0 | 0 |
| 635.0 | 0 |
| 634.0 | 0 |
| 633.0 | 0 |
| 632.0 | 0 |
| 631.0 | 0 |
| 630.0 | 0 |
| 629.0 | 0 |
| 628.0 | 0 |
| 627.0 | 0 |
| 626.0 | 0 |
| 625.0 | 0 |
| 624.0 | 0 |
| 623.0 | 0 |
| 622.0 | 0 |
| 621.0 | 0 |
| 620.0 | 0 |
| 619.0 | 0 |
| 618.0 | 0 |
| 617.0 | 0 |
| 616.0 | 0 |
| 615.0 | 0 |
| 614.0 | 0 |
| 613.0 | 0 |
| 612.0 | 0 |
| 611.0 | 0 |
| 610.0 | 0 |
| 609.0 | 0 |
| 608.0 | 0 |
| 607.0 | 0 |
| 606.0 | 0 |
| 605.0 | 0 |
| 604.0 | 0 |
| 603.0 | 0 |
| 602.0 | 0 |
| 601.0 | 0 |
| 600.0 | 0 |
| 599.0 | 0 |
| 598.0 | 0 |
| 597.0 | 0 |
| 596.0 | 0 |
| 595.0 | 0 |
| 594.0 | 0 |
| 593.0 | 0 |
| 592.0 | 0 |
| 591.0 | 0 |
| 590.0 | 0 |
| 589.0 | 0 |
| 588.0 | 0 |
| 587.0 | 0 |
| 586.0 | 0 |
| 585.0 | 0 |
| 584.0 | 0 |
| 583.0 | 0 |
| 582.0 | 0 |
| 581.0 | 0 |
| 580.0 | 0 |
| 579.0 | 0 |
| 578.0 | 0 |
| 577.0 | 0 |
| 576.0 | 0 |
| 575.0 | 0 |
| 574.0 | 0 |
| 573.0 | 0 |
| 572.0 | 0 |
| 571.0 | 0 |
| 570.0 | 0 |
| 569.0 | 0 |
| 568.0 | 0 |
| 567.0 | 0 |
| 566.0 | 0 |
| 565.0 | 0 |
| 564.0 | 0 |
| 563.0 | 0 |
| 562.0 | 0 |
| 561.0 | 0 |
| 560.0 | 0 |
| 559.0 | 0 |
| 558.0 | 0 |
| 557.0 | 0 |
| 556.0 | 0 |
| 555.0 | 0 |
| 554.0 | 0 |
| 553.0 | 0 |
| 552.0 | 0 |
| 551.0 | 0 |
| 550.0 | 0 |
| 549.0 | 0 |
| 548.0 | 0 |
| 547.0 | 0 |
| 546.0 | 0 |
| 545.0 | 0 |
| 544.0 | 0 |
| 543.0 | 0 |
| 542.0 | 0 |
| 541.0 | 0 |
| 540.0 | 0 |
| 539.0 | 0 |
| 538.0 | 0 |
| 537.0 | 0 |
| 536.0 | 0 |
| 535.0 | 0 |
| 534.0 | 0 |
| 533.0 | 0 |
| 532.0 | 0 |
| 531.0 | 0 |
| 530.0 | 0 |
| 529.0 | 0 |
| 528.0 | 0 |
| 527.0 | 0 |
| 526.0 | 0 |
| 525.0 | 0 |
| 524.0 | 0 |
| 523.0 | 0 |
| 522.0 | 0 |
| 521.0 | 0 |
| 520.0 | 0 |
| 519.0 | 0 |
| 518.0 | 0 |
| 517.0 | 0 |
| 516.0 | 0 |
| 515.0 | 0 |
| 514.0 | 0 |
| 513.0 | 0 |
| 512.0 | 0 |
| 511.0 | 0 |
| 510.0 | 0 |
| 509.0 | 0 |
| 508.0 | 0 |
| 507.0 | 0 |
| 506.0 | 0 |
| 505.0 | 0 |
| 504.0 | 0 |
| 503.0 | 0 |
| 502.0 | 0 |
| 501.0 | 0 |
| 500.0 | 0 |
| 499.0 | 0 |
| 498.0 | 0 |
| 497.0 | 0 |
| 496.0 | 0 |
| 495.0 | 0 |
| 494.0 | 0 |
| 493.0 | 0 |
| 492.0 | 0 |
| 491.0 | 0.001 |
| 490.0 | 0.001 |
| 489.0 | 0.001 |
| 488.0 | 0.001 |
| 487.0 | 0.001 |
| 486.0 | 0.001 |
| 485.0 | 0.001 |
| 484.0 | 0.001 |
| 483.0 | 0.001 |
| 482.0 | 0.001 |
| 481.0 | 0.001 |
| 480.0 | 0.001 |
| 479.0 | 0.001 |
| 478.0 | 0.001 |
| 477.0 | 0.001 |
| 476.0 | 0.002 |
| 475.0 | 0.002 |
| 474.0 | 0.002 |
| 473.0 | 0.002 |
| 472.0 | 0.003 |
| 471.0 | 0.003 |
| 470.0 | 0.004 |
| 469.0 | 0.004 |
| 468.0 | 0.005 |
| 467.0 | 0.006 |
| 466.0 | 0.007 |
| 465.0 | 0.009 |
| 464.0 | 0.011 |
| 463.0 | 0.014 |
| 462.0 | 0.018 |
| 461.0 | 0.023 |
| 460.0 | 0.029 |
| 459.0 | 0.039 |
| 458.0 | 0.053 |
| 457.0 | 0.073 |
| 456.0 | 0.103 |
| 455.0 | 0.151 |
| 454.0 | 0.227 |
| 453.0 | 0.356 |
| 452.0 | 0.584 |
| 451.0 | 1.011 |
| 450.0 | 1.867 |
| 449.0 | 3.661 |
| 448.0 | 7.402 |
| 447.0 | 14.511 |
| 446.0 | 25.075 |
| 445.0 | 36.27 |
| 444.0 | 44.463 |
| 443.0 | 48.669 |
| 442.0 | 50.511 |
| 441.0 | 51.038 |
| 440.0 | 50.312 |
| 439.0 | 48.525 |
| 438.0 | 45.649 |
| 437.0 | 40.342 |
| 436.0 | 31.287 |
| 435.0 | 20.205 |
| 434.0 | 10.755 |
| 433.0 | 5.093 |
| 432.0 | 2.356 |
| 431.0 | 1.139 |
| 430.0 | 0.591 |
| 429.0 | 0.326 |
| 428.0 | 0.189 |
| 427.0 | 0.116 |
| 426.0 | 0.074 |
| 425.0 | 0.049 |
| 424.0 | 0.033 |
| 423.0 | 0.023 |
| 422.0 | 0.017 |
| 421.0 | 0.012 |
| 420.0 | 0.009 |
| 419.0 | 0.007 |
| 418.0 | 0.005 |
| 417.0 | 0.004 |
| 416.0 | 0.003 |
| 415.0 | 0.002 |
| 414.0 | 0.002 |
| 413.0 | 0.001 |
| 412.0 | 0.001 |
| 411.0 | 0.001 |
| 410.0 | 0 |
| 409.0 | 0 |
| 408.0 | 0 |
| 407.0 | 0 |
| 406.0 | 0 |
| 405.0 | 0 |
| 404.0 | 0 |
| 403.0 | 0 |
| 402.0 | 0 |
| 401.0 | 0 |
| 400.0 | 0 |
| 399.0 | 0 |
| 398.0 | 0 |
| 397.0 | 0 |
| 396.0 | 0 |
| 395.0 | 0 |
| 394.0 | 0 |
| 393.0 | 0 |
| 392.0 | 0 |
| 391.0 | 0 |
| 390.0 | 0 |
| 389.0 | 0 |
| 388.0 | 0 |
| 387.0 | 0 |
| 386.0 | 0 |
| 385.0 | 0 |
| 384.0 | 0 |
| 383.0 | 0 |
| 382.0 | 0 |
| 381.0 | 0 |
| 380.0 | 0 |
| 379.0 | 0 |
| 378.0 | 0 |
| 377.0 | 0 |
| 376.0 | 0 |
| 375.0 | 0 |
| 374.0 | 0 |
| 373.0 | 0 |
| 372.0 | 0 |
| 371.0 | 0 |
| 370.0 | 0 |
| 369.0 | 0 |
| 368.0 | 0 |
| 367.0 | 0 |
| 366.0 | 0 |
| 365.0 | 0 |
| 364.0 | 0 |
| 363.0 | 0 |
| 362.0 | 0 |
| 361.0 | 0 |
| 360.0 | 0 |
| 359.0 | 0 |
| 358.0 | 0 |
| 357.0 | 0 |
| 356.0 | 0 |
| 355.0 | 0 |
| 354.0 | 0 |
| 353.0 | 0 |
| 352.0 | 0 |
| 351.0 | 0 |
| 350.0 | 0 |
| 349.0 | 0 |
| 348.0 | 0 |
| 347.0 | 0 |
| 346.0 | 0 |
| 345.0 | 0 |
| 344.0 | 0 |
| 343.0 | 0 |
| 342.0 | 0 |
| 341.0 | 0 |
| 340.0 | 0 |
| 339.0 | 0 |
| 338.0 | 0 |
| 337.0 | 0 |
| 336.0 | 0 |
| 335.0 | 0 |
| 334.0 | 0 |
| 333.0 | 0 |
| 332.0 | 0 |
| 331.0 | 0 |
| 330.0 | 0 |
| 329.0 | 0 |
| 328.0 | 0 |
| 327.0 | 0 |
| 326.0 | 0 |
| 325.0 | 0 |
| 324.0 | 0 |
| 323.0 | 0 |
| 322.0 | 0 |
| 321.0 | 0 |
| 320.0 | 0 |
| 319.0 | 0 |
| 318.0 | 0 |
| 317.0 | 0 |
| 316.0 | 0 |
| 315.0 | 0 |
| 314.0 | 0 |
| 313.0 | 0 |
| 312.0 | 0 |
| 311.0 | 0 |
| 310.0 | 0 |
| 309.0 | 0 |
| 308.0 | 0 |
| 307.0 | 0 |
| 306.0 | 0 |
| 305.0 | 0 |
| 304.0 | 0 |
| 303.0 | 0 |
| 302.0 | 0 |
| 301.0 | 0 |
| 300.0 | 0 |
| 299.0 | 0 |
| 298.0 | 0 |
| 297.0 | 0 |
| 296.0 | 0 |
| 295.0 | 0 |
| 294.0 | 0 |
| 293.0 | 0 |
| 292.0 | 0 |
| 291.0 | 0 |
| 290.0 | 0 |
| 289.0 | 0 |
| 288.0 | 0 |
| 287.0 | 0 |
| 286.0 | 0 |
| 285.0 | 0 |
| 284.0 | 0 |
| 283.0 | 0 |
| 282.0 | 0 |
| 281.0 | 0 |
| 280.0 | 0 |
| 279.0 | 0 |
| 278.0 | 0 |
| 277.0 | 0 |
| 276.0 | 0 |
| 275.0 | 0 |
| 274.0 | 0 |
| 273.0 | 0 |
| 272.0 | 0 |
| 271.0 | 0 |
| 270.0 | 0 |
| 269.0 | 0 |
| 268.0 | 0 |
| 267.0 | 0 |
| 266.0 | 0 |
| 265.0 | 0 |
| 264.0 | 0 |
| 263.0 | 0 |
| 262.0 | 0 |
| 261.0 | 0 |
| 260.0 | 0 |
| 259.0 | 0 |
| 258.0 | 0 |
| 257.0 | 0 |
| 256.0 | 0 |
| 255.0 | 0 |
| 254.0 | 0 |
| 253.0 | 0 |
| 252.0 | 0 |
| 251.0 | 0 |
| 250.0 | 0 |
| 249.0 | 0 |
| 248.0 | 0 |
| 247.0 | 0 |
| 246.0 | 0 |
| 245.0 | 0 |
| 244.0 | 0 |
| 243.0 | 0 |
| 242.0 | 0 |
| 241.0 | 0 |
| 240.0 | 0 |
| 239.0 | 0 |
| 238.0 | 0 |
| 237.0 | 0 |
| 236.0 | 0 |
| 235.0 | 0 |
| 234.0 | 0 |
| 233.0 | 0 |
| 232.0 | 0 |
| 231.0 | 0 |
| 230.0 | 0 |
| 229.0 | 0 |
| 228.0 | 0 |
| 227.0 | 0 |
| 226.0 | 0 |
| 225.0 | 0 |
| 224.0 | 0 |
| 223.0 | 0 |
| 222.0 | 0 |
| 221.0 | 0 |
| 220.0 | 0 |
| 219.0 | 0 |
| 218.0 | 0 |
| 217.0 | 0 |
| 216.0 | 0 |
| 215.0 | 0 |
| 214.0 | 0 |
| 213.0 | 0 |
| 212.0 | 0 |
| 211.0 | 0 |
| 210.0 | 0 |
| 209.0 | 0 |
| 208.0 | 0 |
| 207.0 | 0 |
| 206.0 | 0 |
| 205.0 | 0 |
| 204.0 | 0 |
| 203.0 | 0 |
| 202.0 | 0 |
| 201.0 | 0 |